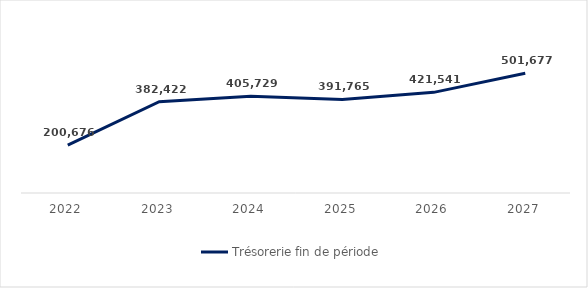
| Category | Trésorerie fin de période |
|---|---|
| 2022 | 200676.062 |
| 2023 | 382422.031 |
| 2024 | 405729.312 |
| 2025 | 391765.094 |
| 2026 | 421541.094 |
| 2027 | 501677.031 |